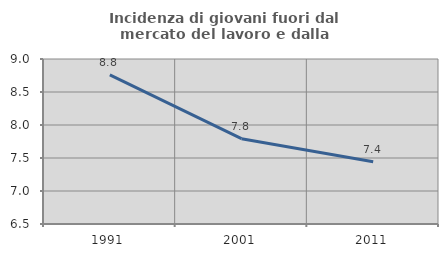
| Category | Incidenza di giovani fuori dal mercato del lavoro e dalla formazione  |
|---|---|
| 1991.0 | 8.758 |
| 2001.0 | 7.792 |
| 2011.0 | 7.444 |